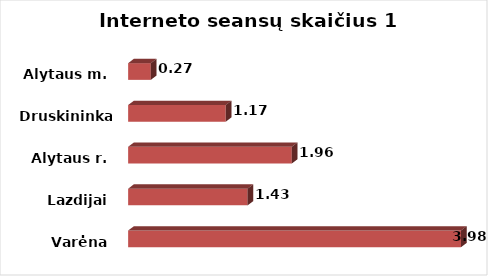
| Category | Series 0 |
|---|---|
| Varėna | 3.978 |
| Lazdijai | 1.428 |
| Alytaus r. | 1.956 |
| Druskininkai  | 1.167 |
| Alytaus m. | 0.271 |